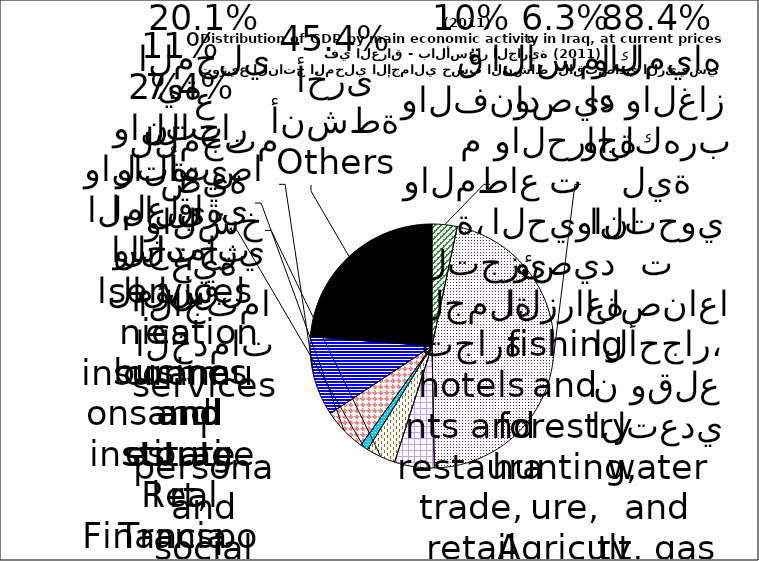
| Category | Series 0 |
|---|---|
| Agriculture, hunting, forestry and fishing | 8808617.7 |
| Mining and quarrying, manufacturing, electricity, gaz and water | 122736328.3 |
| Wholesale and retail trade, restaurants and hotels | 13941554.687 |
| Transport, storage and communication | 10323645.9 |
| Financial institutions and insurance | 2779312.2 |
| Real estate and business services | 15296401.9 |
| Community social and personal services | 27882846 |
| Others | -62962403.718 |